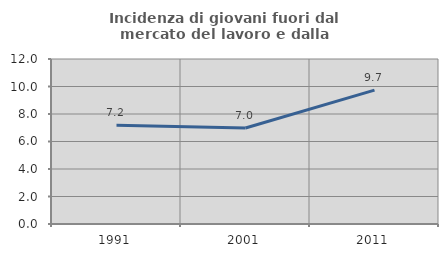
| Category | Incidenza di giovani fuori dal mercato del lavoro e dalla formazione  |
|---|---|
| 1991.0 | 7.175 |
| 2001.0 | 6.986 |
| 2011.0 | 9.739 |